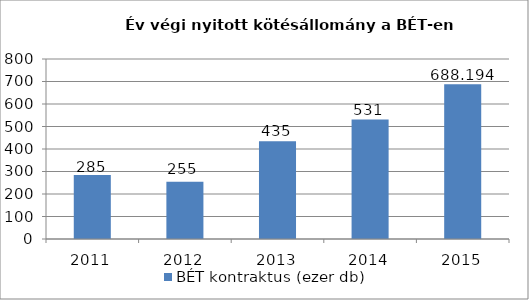
| Category | BÉT kontraktus (ezer db) |
|---|---|
| 2011.0 | 285 |
| 2012.0 | 255 |
| 2013.0 | 435 |
| 2014.0 | 531 |
| 2015.0 | 688.194 |